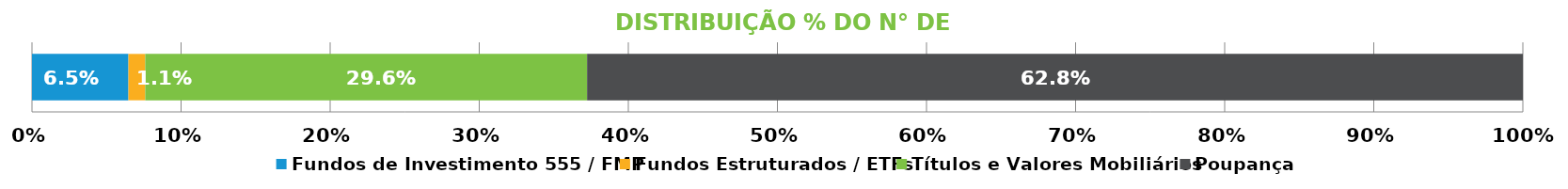
| Category | Fundos de Investimento 555 / FMP | Fundos Estruturados / ETFs | Títulos e Valores Mobiliários | Poupança |
|---|---|---|---|---|
| 0 | 0.065 | 0.011 | 0.296 | 0.628 |